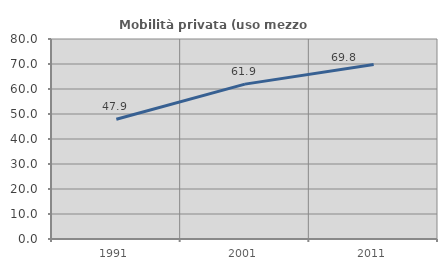
| Category | Mobilità privata (uso mezzo privato) |
|---|---|
| 1991.0 | 47.909 |
| 2001.0 | 61.95 |
| 2011.0 | 69.818 |